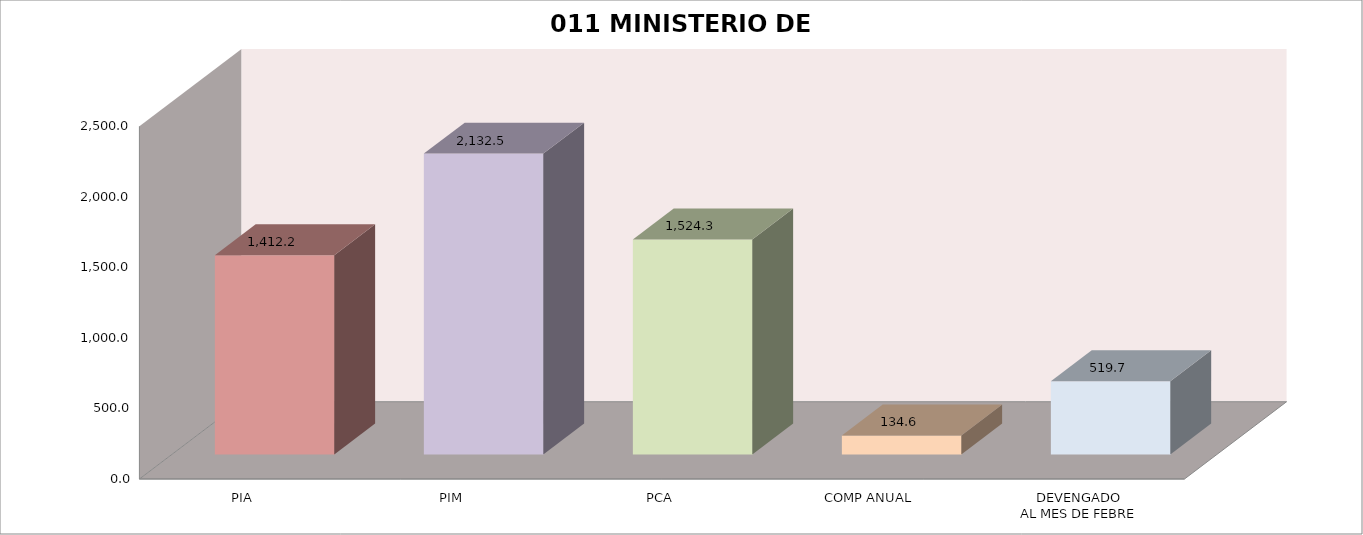
| Category | 011 MINISTERIO DE SALUD |
|---|---|
| PIA | 1412.218 |
| PIM | 2132.549 |
| PCA | 1524.32 |
| COMP ANUAL | 134.62 |
| DEVENGADO
AL MES DE FEBRE | 519.726 |